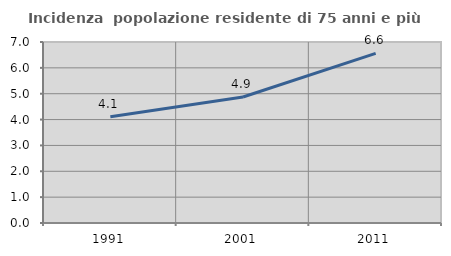
| Category | Incidenza  popolazione residente di 75 anni e più |
|---|---|
| 1991.0 | 4.113 |
| 2001.0 | 4.873 |
| 2011.0 | 6.559 |